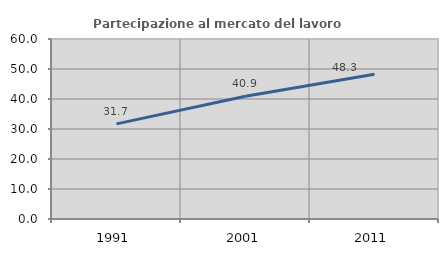
| Category | Partecipazione al mercato del lavoro  femminile |
|---|---|
| 1991.0 | 31.715 |
| 2001.0 | 40.914 |
| 2011.0 | 48.264 |